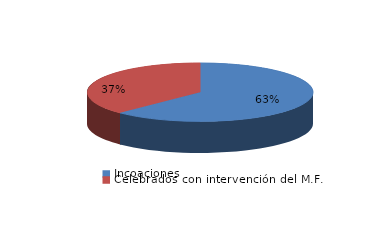
| Category | Series 0 |
|---|---|
| Incoaciones | 10193 |
| Celebrados con intervención del M.F. | 6115 |